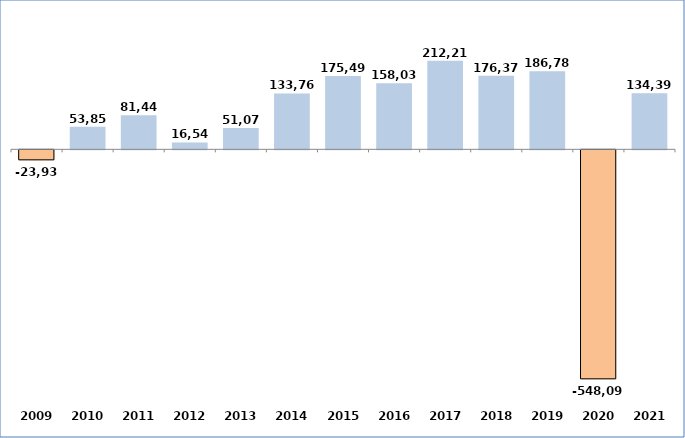
| Category | Series 0 |
|---|---|
| 2009 | -23938.56 |
| 2010 | 53851.71 |
| 2011 | 81446.57 |
| 2012 | 16548.79 |
| 2013 | 51077.47 |
| 2014 | 133764.72 |
| 2015 | 175495.4 |
| 2016 | 158037.61 |
| 2017 | 212215.67 |
| 2018 | 176373.25 |
| 2019 | 186785 |
| 2020 | -548093 |
| 2021 | 134396.18 |